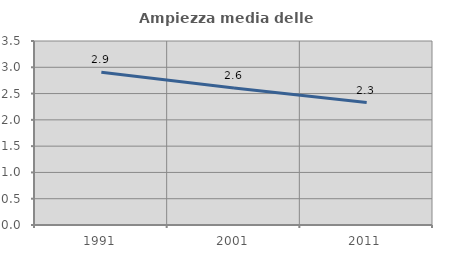
| Category | Ampiezza media delle famiglie |
|---|---|
| 1991.0 | 2.905 |
| 2001.0 | 2.605 |
| 2011.0 | 2.329 |